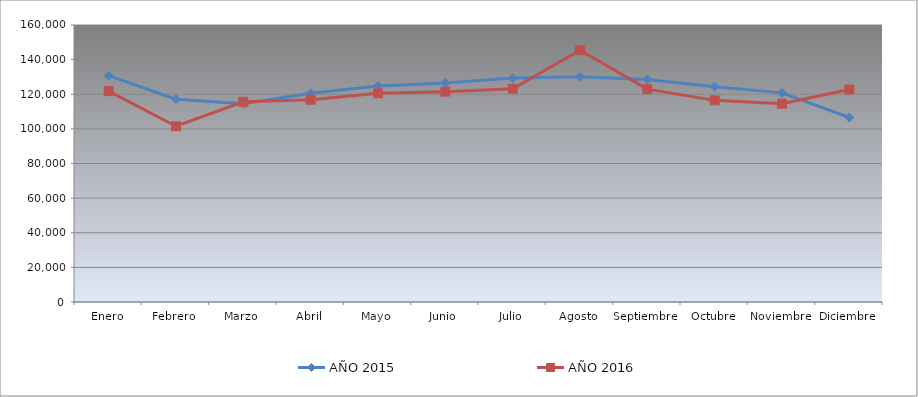
| Category | AÑO 2015 | AÑO 2016 |
|---|---|---|
| Enero | 130782.877 | 121823.865 |
| Febrero | 117151.86 | 101533.449 |
| Marzo | 114555.088 | 115623.224 |
| Abril | 120574.877 | 116860.097 |
| Mayo | 124828.211 | 120525.961 |
| Junio | 126517.333 | 121514.646 |
| Julio | 129342.035 | 123158.386 |
| Agosto | 130086.877 | 145458.72 |
| Septiembre | 128462.877 | 122934.609 |
| Octubre | 124368.281 | 116469.506 |
| Noviembre | 120806.877 | 114545.029 |
| Diciembre | 106573.474 | 122706.764 |